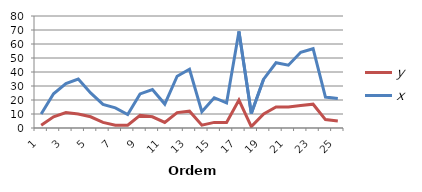
| Category | y | x |
|---|---|---|
| 1.0 | 2 | 9.95 |
| 2.0 | 8 | 24.45 |
| 3.0 | 11 | 31.75 |
| 4.0 | 10 | 35 |
| 5.0 | 8 | 25.02 |
| 6.0 | 4 | 16.86 |
| 7.0 | 2 | 14.38 |
| 8.0 | 2 | 9.6 |
| 9.0 | 9 | 24.35 |
| 10.0 | 8 | 27.5 |
| 11.0 | 4 | 17.08 |
| 12.0 | 11 | 37 |
| 13.0 | 12 | 41.95 |
| 14.0 | 2 | 11.66 |
| 15.0 | 4 | 21.65 |
| 16.0 | 4 | 17.89 |
| 17.0 | 20 | 69 |
| 18.0 | 1 | 10.3 |
| 19.0 | 10 | 34.93 |
| 20.0 | 15 | 46.59 |
| 21.0 | 15 | 44.88 |
| 22.0 | 16 | 54.12 |
| 23.0 | 17 | 56.63 |
| 24.0 | 6 | 22.13 |
| 25.0 | 5 | 21.15 |